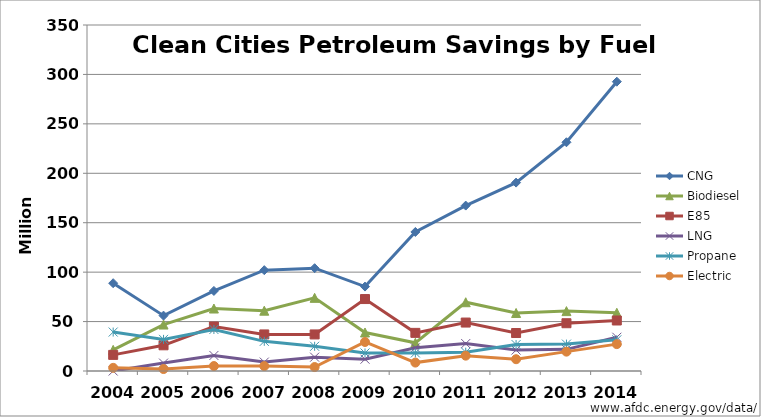
| Category | CNG | Biodiesel | E85 | LNG | Propane | Electric |
|---|---|---|---|---|---|---|
| 2004.0 | 88.8 | 21.4 | 16.3 | 0 | 39.4 | 3.2 |
| 2005.0 | 56 | 47 | 26 | 8 | 32 | 2 |
| 2006.0 | 81 | 63.2 | 45 | 15.7 | 42 | 5 |
| 2007.0 | 102 | 61 | 37 | 9 | 30 | 5 |
| 2008.0 | 104 | 74 | 37 | 14 | 25 | 4 |
| 2009.0 | 85.398 | 38.977 | 72.783 | 11.939 | 18.229 | 29.354 |
| 2010.0 | 140.64 | 28.521 | 38.576 | 23.419 | 18.26 | 8.512 |
| 2011.0 | 167.325 | 69.569 | 49.009 | 27.752 | 19.017 | 15.525 |
| 2012.0 | 190.57 | 58.708 | 38.418 | 21.181 | 26.73 | 11.922 |
| 2013.0 | 231.383 | 60.575 | 48.32 | 21.908 | 27.202 | 19.583 |
| 2014.0 | 292.654 | 58.908 | 51.088 | 34.151 | 31.534 | 27.193 |